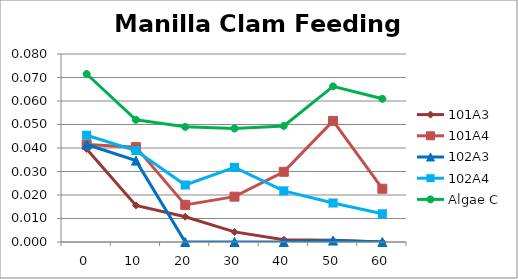
| Category | 101A3 | 101A4 | 102A3 | 102A4 | Algae C |
|---|---|---|---|---|---|
| 0.0 | 0.04 | 0.041 | 0.041 | 0.045 | 0.072 |
| 10.0 | 0.016 | 0.04 | 0.035 | 0.039 | 0.052 |
| 20.0 | 0.011 | 0.016 | 0 | 0.024 | 0.049 |
| 30.0 | 0.004 | 0.019 | 0 | 0.032 | 0.048 |
| 40.0 | 0.001 | 0.03 | 0 | 0.022 | 0.049 |
| 50.0 | 0.001 | 0.052 | 0.001 | 0.017 | 0.066 |
| 60.0 | 0 | 0.023 | 0 | 0.012 | 0.061 |